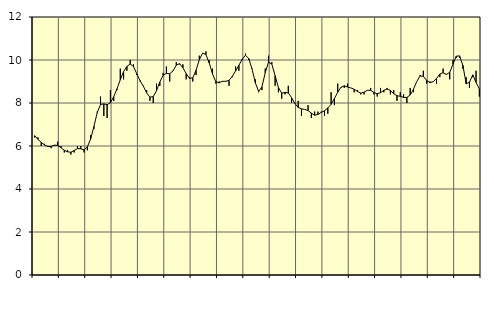
| Category | Piggar | Series 1 |
|---|---|---|
| nan | 6.4 | 6.48 |
| 87.0 | 6.4 | 6.31 |
| 87.0 | 6 | 6.17 |
| 87.0 | 6.1 | 6.05 |
| nan | 6 | 5.98 |
| 88.0 | 5.9 | 5.98 |
| 88.0 | 6 | 6.04 |
| 88.0 | 6.2 | 6.03 |
| nan | 6 | 5.92 |
| 89.0 | 5.7 | 5.8 |
| 89.0 | 5.8 | 5.73 |
| 89.0 | 5.6 | 5.71 |
| nan | 5.7 | 5.79 |
| 90.0 | 6 | 5.88 |
| 90.0 | 6 | 5.87 |
| 90.0 | 5.7 | 5.82 |
| nan | 5.8 | 5.96 |
| 91.0 | 6.5 | 6.33 |
| 91.0 | 6.8 | 6.91 |
| 91.0 | 7.6 | 7.56 |
| nan | 8.3 | 7.93 |
| 92.0 | 7.4 | 7.96 |
| 92.0 | 7.3 | 7.92 |
| 92.0 | 8.6 | 8.01 |
| nan | 8.1 | 8.29 |
| 93.0 | 8.6 | 8.66 |
| 93.0 | 9.6 | 9.08 |
| 93.0 | 9.1 | 9.46 |
| nan | 9.5 | 9.7 |
| 94.0 | 10 | 9.81 |
| 94.0 | 9.8 | 9.7 |
| 94.0 | 9.3 | 9.36 |
| nan | 9 | 9.04 |
| 95.0 | 8.8 | 8.78 |
| 95.0 | 8.6 | 8.47 |
| 95.0 | 8.1 | 8.27 |
| nan | 8 | 8.3 |
| 96.0 | 8.9 | 8.57 |
| 96.0 | 8.8 | 8.98 |
| 96.0 | 9.4 | 9.29 |
| nan | 9.7 | 9.38 |
| 97.0 | 9 | 9.36 |
| 97.0 | 9.5 | 9.49 |
| 97.0 | 9.9 | 9.76 |
| nan | 9.8 | 9.83 |
| 98.0 | 9.8 | 9.64 |
| 98.0 | 9.1 | 9.37 |
| 98.0 | 9.2 | 9.15 |
| nan | 9 | 9.17 |
| 99.0 | 9.3 | 9.52 |
| 99.0 | 10.2 | 10.02 |
| 99.0 | 10.3 | 10.32 |
| nan | 10.4 | 10.25 |
| 0.0 | 10 | 9.86 |
| 0.0 | 9.6 | 9.35 |
| 0.0 | 8.9 | 8.99 |
| nan | 9 | 8.94 |
| 1.0 | 9 | 9.01 |
| 1.0 | 9 | 9.01 |
| 1.0 | 8.8 | 9.05 |
| nan | 9.2 | 9.24 |
| 2.0 | 9.7 | 9.49 |
| 2.0 | 9.5 | 9.75 |
| 2.0 | 10 | 10.04 |
| nan | 10.3 | 10.22 |
| 3.0 | 10 | 10.07 |
| 3.0 | 9.6 | 9.58 |
| 3.0 | 9.1 | 8.94 |
| nan | 8.5 | 8.54 |
| 4.0 | 8.6 | 8.75 |
| 4.0 | 9.6 | 9.41 |
| 4.0 | 10.2 | 9.9 |
| nan | 9.9 | 9.81 |
| 5.0 | 8.8 | 9.27 |
| 5.0 | 8.5 | 8.72 |
| 5.0 | 8.2 | 8.46 |
| nan | 8.4 | 8.49 |
| 6.0 | 8.8 | 8.47 |
| 6.0 | 8 | 8.25 |
| 6.0 | 8 | 7.98 |
| nan | 8.1 | 7.79 |
| 7.0 | 7.4 | 7.73 |
| 7.0 | 7.7 | 7.7 |
| 7.0 | 7.9 | 7.65 |
| nan | 7.3 | 7.53 |
| 8.0 | 7.6 | 7.43 |
| 8.0 | 7.6 | 7.47 |
| 8.0 | 7.6 | 7.56 |
| nan | 7.4 | 7.64 |
| 9.0 | 7.5 | 7.77 |
| 9.0 | 8.5 | 7.94 |
| 9.0 | 7.9 | 8.21 |
| nan | 8.9 | 8.5 |
| 10.0 | 8.7 | 8.73 |
| 10.0 | 8.7 | 8.8 |
| 10.0 | 8.9 | 8.74 |
| nan | 8.7 | 8.7 |
| 11.0 | 8.5 | 8.64 |
| 11.0 | 8.6 | 8.54 |
| 11.0 | 8.4 | 8.46 |
| nan | 8.4 | 8.5 |
| 12.0 | 8.6 | 8.59 |
| 12.0 | 8.7 | 8.59 |
| 12.0 | 8.4 | 8.49 |
| nan | 8.3 | 8.43 |
| 13.0 | 8.7 | 8.48 |
| 13.0 | 8.5 | 8.59 |
| 13.0 | 8.7 | 8.65 |
| nan | 8.4 | 8.58 |
| 14.0 | 8.6 | 8.43 |
| 14.0 | 8.1 | 8.34 |
| 14.0 | 8.5 | 8.31 |
| nan | 8.4 | 8.26 |
| 15.0 | 8 | 8.26 |
| 15.0 | 8.7 | 8.37 |
| 15.0 | 8.5 | 8.64 |
| nan | 9 | 9 |
| 16.0 | 9.3 | 9.26 |
| 16.0 | 9.5 | 9.24 |
| 16.0 | 8.9 | 9.05 |
| nan | 9 | 8.95 |
| 17.0 | 9 | 8.99 |
| 17.0 | 8.9 | 9.14 |
| 17.0 | 9.2 | 9.35 |
| nan | 9.6 | 9.41 |
| 18.0 | 9.3 | 9.33 |
| 18.0 | 9.1 | 9.42 |
| 18.0 | 10 | 9.81 |
| nan | 10.1 | 10.18 |
| 19.0 | 10.1 | 10.19 |
| 19.0 | 9.6 | 9.75 |
| 19.0 | 9.2 | 8.89 |
| nan | 8.7 | 8.97 |
| 20.0 | 9.2 | 9.31 |
| 20.0 | 9.5 | 8.96 |
| 20.0 | 8.3 | 8.65 |